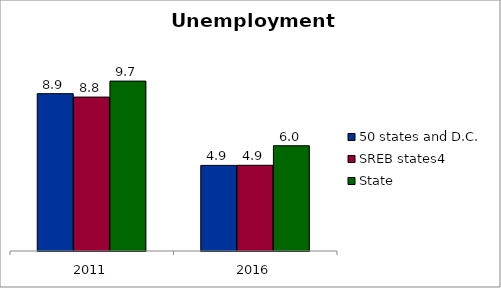
| Category | 50 states and D.C. | SREB states4 | State |
|---|---|---|---|
| 2011.0 | 8.949 | 8.754 | 9.663 |
| 2016.0 | 4.869 | 4.875 | 5.987 |